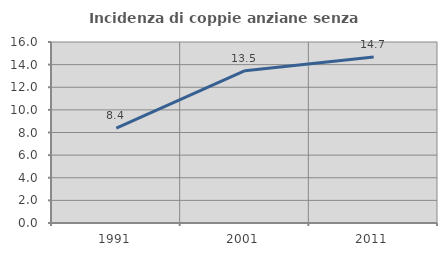
| Category | Incidenza di coppie anziane senza figli  |
|---|---|
| 1991.0 | 8.396 |
| 2001.0 | 13.468 |
| 2011.0 | 14.671 |